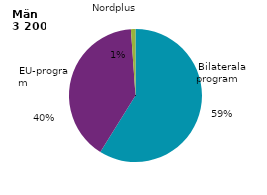
| Category | Series 0 |
|---|---|
| Bilaterala program                                 | 1864 |
| EU-program                                         | 1267 |
| Nordplus                                           | 35 |